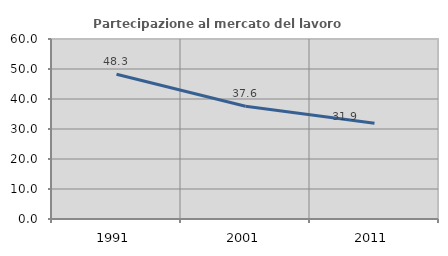
| Category | Partecipazione al mercato del lavoro  femminile |
|---|---|
| 1991.0 | 48.271 |
| 2001.0 | 37.589 |
| 2011.0 | 31.915 |